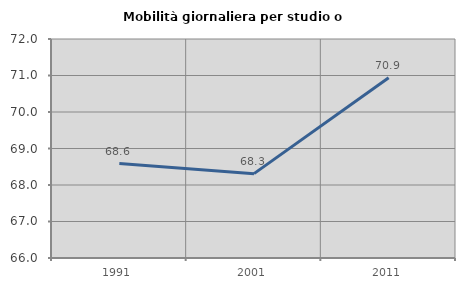
| Category | Mobilità giornaliera per studio o lavoro |
|---|---|
| 1991.0 | 68.586 |
| 2001.0 | 68.311 |
| 2011.0 | 70.94 |